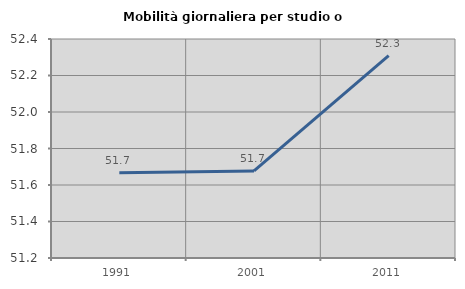
| Category | Mobilità giornaliera per studio o lavoro |
|---|---|
| 1991.0 | 51.667 |
| 2001.0 | 51.677 |
| 2011.0 | 52.309 |